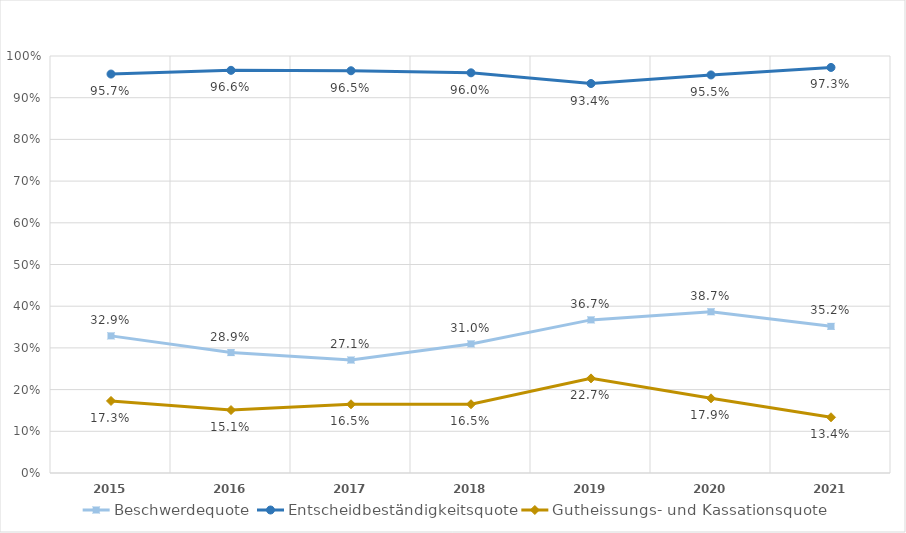
| Category | Beschwerdequote | Entscheidbeständigkeitsquote | Gutheissungs- und Kassationsquote |
|---|---|---|---|
| 2015.0 | 0.329 | 0.957 | 0.173 |
| 2016.0 | 0.289 | 0.966 | 0.151 |
| 2017.0 | 0.271 | 0.965 | 0.165 |
| 2018.0 | 0.31 | 0.96 | 0.165 |
| 2019.0 | 0.367 | 0.934 | 0.227 |
| 2020.0 | 0.387 | 0.955 | 0.179 |
| 2021.0 | 0.352 | 0.973 | 0.134 |